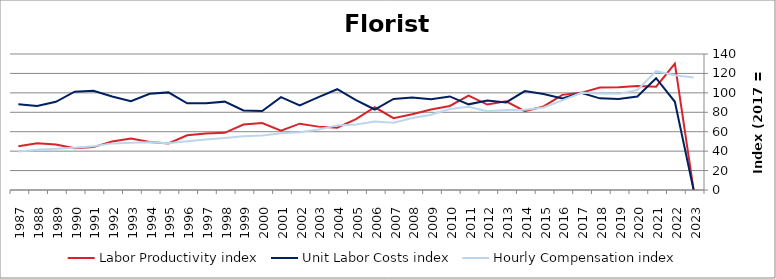
| Category | Labor Productivity index | Unit Labor Costs index | Hourly Compensation index |
|---|---|---|---|
| 2023.0 | 0 | 0 | 115.811 |
| 2022.0 | 130.087 | 90.819 | 118.144 |
| 2021.0 | 106.372 | 115.056 | 122.388 |
| 2020.0 | 106.946 | 96.275 | 102.962 |
| 2019.0 | 105.728 | 93.611 | 98.973 |
| 2018.0 | 105.422 | 94.349 | 99.464 |
| 2017.0 | 100 | 100 | 100 |
| 2016.0 | 97.953 | 94.158 | 92.231 |
| 2015.0 | 86.012 | 98.782 | 84.964 |
| 2014.0 | 81.211 | 101.837 | 82.703 |
| 2013.0 | 91.273 | 90.141 | 82.275 |
| 2012.0 | 87.951 | 92.231 | 81.118 |
| 2011.0 | 97.087 | 88.173 | 85.605 |
| 2010.0 | 86.484 | 96.326 | 83.307 |
| 2009.0 | 82.904 | 93.491 | 77.508 |
| 2008.0 | 77.907 | 95.257 | 74.212 |
| 2007.0 | 73.927 | 93.771 | 69.323 |
| 2006.0 | 85.162 | 82.867 | 70.571 |
| 2005.0 | 72.873 | 92.603 | 67.483 |
| 2004.0 | 64.111 | 103.749 | 66.515 |
| 2003.0 | 65.238 | 95.604 | 62.37 |
| 2002.0 | 68.277 | 86.986 | 59.391 |
| 2001.0 | 61.048 | 95.626 | 58.378 |
| 2000.0 | 69.008 | 81.312 | 56.112 |
| 1999.0 | 67.406 | 81.901 | 55.206 |
| 1998.0 | 58.888 | 90.956 | 53.562 |
| 1997.0 | 58.267 | 89.333 | 52.052 |
| 1996.0 | 56.278 | 89.287 | 50.249 |
| 1995.0 | 47.981 | 100.483 | 48.212 |
| 1994.0 | 49.485 | 99.085 | 49.032 |
| 1993.0 | 53.107 | 91.399 | 48.539 |
| 1992.0 | 49.832 | 96.297 | 47.987 |
| 1991.0 | 44.175 | 102.066 | 45.087 |
| 1990.0 | 42.936 | 101.214 | 43.457 |
| 1989.0 | 46.75 | 90.797 | 42.448 |
| 1988.0 | 48.03 | 86.446 | 41.521 |
| 1987.0 | 45.052 | 88.177 | 39.725 |